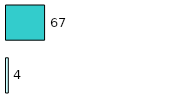
| Category | Series 0 | Series 1 |
|---|---|---|
| 0 | 4 | 67 |